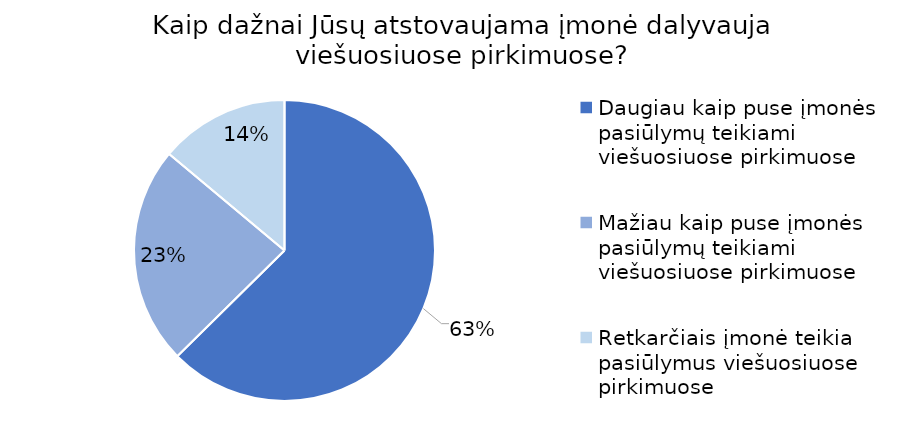
| Category | Series 0 |
|---|---|
| Daugiau kaip puse įmonės pasiūlymų teikiami viešuosiuose pirkimuose | 72 |
| Mažiau kaip puse įmonės pasiūlymų teikiami viešuosiuose pirkimuose | 27 |
| Retkarčiais įmonė teikia pasiūlymus viešuosiuose pirkimuose | 16 |